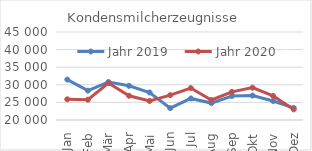
| Category | Jahr 2019 | Jahr 2020 |
|---|---|---|
| Jan | 31489.474 | 25880.356 |
| Feb | 28337.53 | 25761.828 |
| Mär | 30795.709 | 30485.432 |
| Apr | 29709.673 | 26881.431 |
| Mai | 27814.744 | 25419.946 |
| Jun | 23359.288 | 27070.777 |
| Jul | 26122.024 | 29073.292 |
| Aug | 24807.966 | 25677.851 |
| Sep | 26807.512 | 27997.687 |
| Okt | 26943.014 | 29189.886 |
| Nov | 25402.7 | 26832.382 |
| Dez | 23447.352 | 23016.086 |